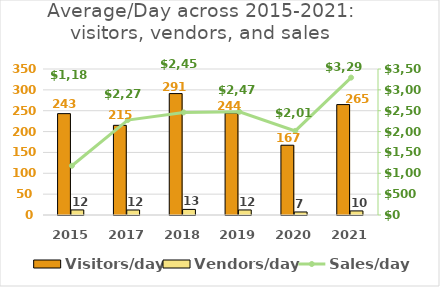
| Category | Visitors/day | Vendors/day |
|---|---|---|
| 2015 | 243 | 12.176 |
| 2017 | 215 | 12 |
| 2018 | 291.056 | 13.389 |
| 2019 | 244.389 | 12.111 |
| 2020 | 167.267 | 7.267 |
| 2021 | 264.688 | 9.812 |